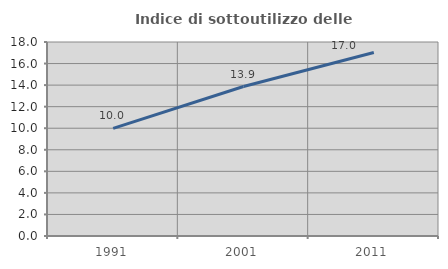
| Category | Indice di sottoutilizzo delle abitazioni  |
|---|---|
| 1991.0 | 9.982 |
| 2001.0 | 13.87 |
| 2011.0 | 17.033 |